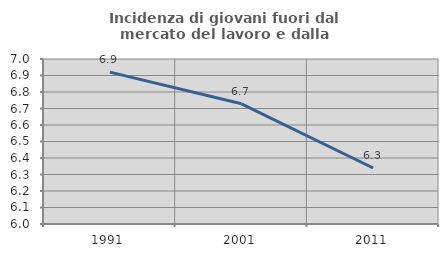
| Category | Incidenza di giovani fuori dal mercato del lavoro e dalla formazione  |
|---|---|
| 1991.0 | 6.92 |
| 2001.0 | 6.729 |
| 2011.0 | 6.339 |